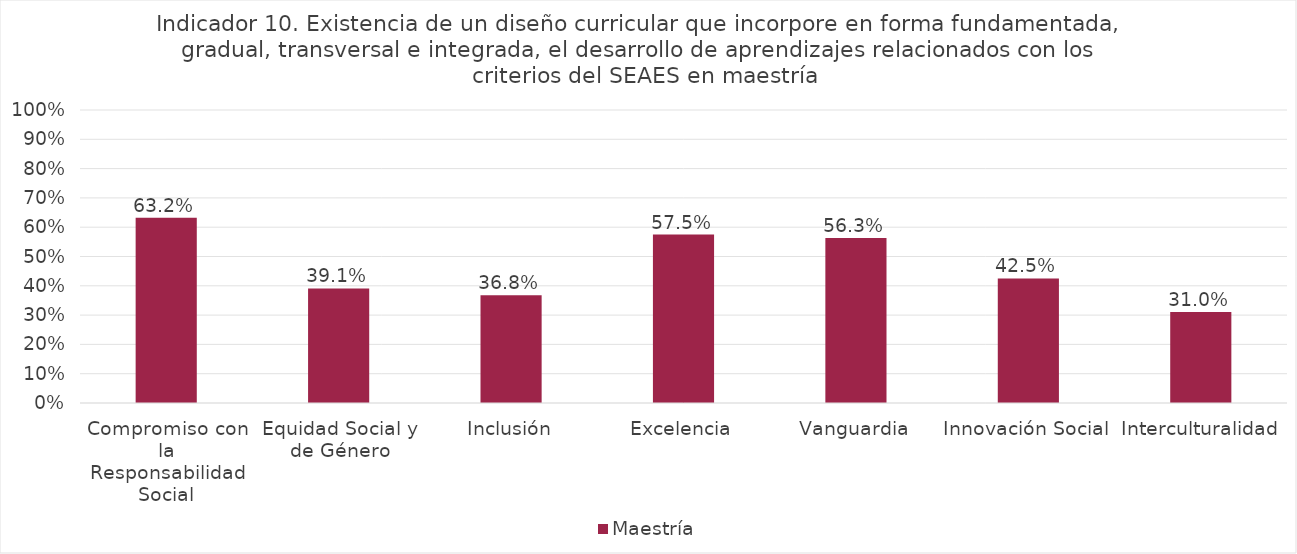
| Category | Maestría |
|---|---|
| Compromiso con la Responsabilidad Social | 0.632 |
| Equidad Social y de Género | 0.391 |
| Inclusión | 0.368 |
| Excelencia | 0.575 |
| Vanguardia | 0.563 |
| Innovación Social | 0.425 |
| Interculturalidad | 0.31 |